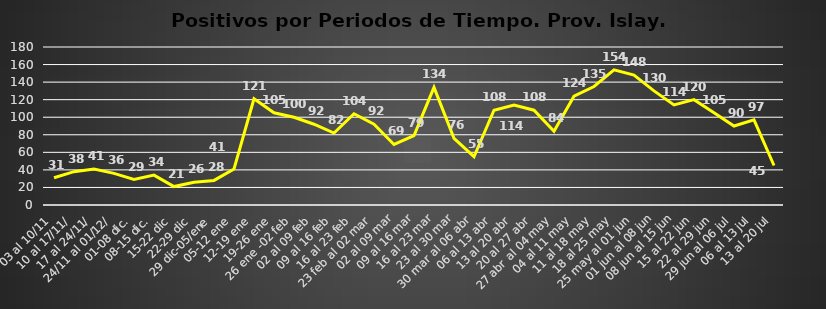
| Category | Prov. Islay |
|---|---|
| 03 al 10/11 | 31 |
| 10 al 17/11/ | 38 |
|  17 al 24/11/ | 41 |
|  24/11 al 01/12/ | 36 |
| 01-08 dic. | 29 |
| 08-15 dic. | 34 |
| 15-22 dic | 21 |
| 22-29 dic | 26 |
| 29 dic-05/ene | 28 |
| 05-12 ene | 41 |
| 12-19 ene | 121 |
| 19-26 ene | 105 |
| 26 ene -02 feb | 100 |
| 02 al 09 feb | 92 |
| 09 al 16 feb | 82 |
| 16 al 23 feb | 104 |
| 23 feb al 02 mar | 92 |
|  02 al 09 mar | 69 |
|  09 al 16 mar | 79 |
|  16 al 23 mar | 134 |
|  23 al 30 mar | 76 |
|  30 mar al 06 abr | 55 |
| 06 al 13 abr | 108 |
| 13 al 20 abr | 114 |
| 20 al 27 abr | 108 |
| 27 abr al 04 may | 84 |
|  04 al 11 may | 124 |
|  11 al 18 may | 135 |
|  18 al 25 may | 154 |
|   25 may al 01 jun | 148 |
|   01 jun al 08 jun | 130 |
|   08 jun al 15 jun | 114 |
|   15 al 22 jun  | 120 |
|   22 al 29 jun  | 105 |
|  29 jun al 06 jul  | 90 |
|   06 al 13 jul  | 97 |
|   13 al 20 jul  | 45 |